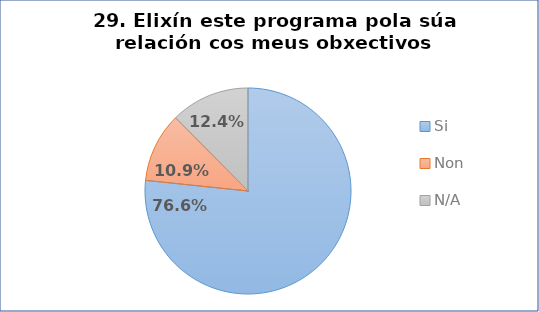
| Category | Pregunta 29. Elixín este programa pola súa relación cos meus obxectivos profesionais |
|---|---|
| Si | 0.766 |
| Non | 0.109 |
| N/A | 0.124 |